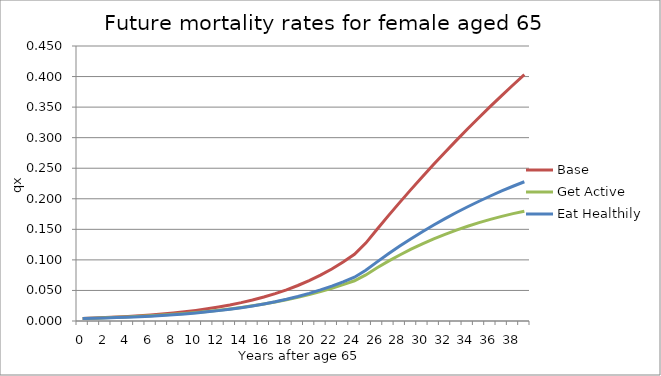
| Category | Base | Get Active | Eat Healthily |
|---|---|---|---|
| 0.0 | 0.004 | 0.004 | 0.004 |
| 1.0 | 0.005 | 0.005 | 0.004 |
| 2.0 | 0.006 | 0.005 | 0.005 |
| 3.0 | 0.006 | 0.006 | 0.006 |
| 4.0 | 0.007 | 0.007 | 0.006 |
| 5.0 | 0.009 | 0.008 | 0.007 |
| 6.0 | 0.01 | 0.009 | 0.008 |
| 7.0 | 0.011 | 0.01 | 0.009 |
| 8.0 | 0.013 | 0.011 | 0.01 |
| 9.0 | 0.015 | 0.012 | 0.012 |
| 10.0 | 0.017 | 0.014 | 0.013 |
| 11.0 | 0.02 | 0.016 | 0.015 |
| 12.0 | 0.023 | 0.018 | 0.017 |
| 13.0 | 0.026 | 0.02 | 0.019 |
| 14.0 | 0.03 | 0.022 | 0.022 |
| 15.0 | 0.034 | 0.025 | 0.025 |
| 16.0 | 0.039 | 0.028 | 0.028 |
| 17.0 | 0.045 | 0.031 | 0.032 |
| 18.0 | 0.051 | 0.035 | 0.036 |
| 19.0 | 0.058 | 0.039 | 0.04 |
| 20.0 | 0.066 | 0.043 | 0.045 |
| 21.0 | 0.075 | 0.048 | 0.051 |
| 22.0 | 0.085 | 0.054 | 0.057 |
| 23.0 | 0.096 | 0.059 | 0.064 |
| 24.0 | 0.109 | 0.066 | 0.072 |
| 25.0 | 0.128 | 0.075 | 0.083 |
| 26.0 | 0.15 | 0.087 | 0.097 |
| 27.0 | 0.172 | 0.098 | 0.11 |
| 28.0 | 0.194 | 0.108 | 0.123 |
| 29.0 | 0.215 | 0.117 | 0.135 |
| 30.0 | 0.236 | 0.126 | 0.146 |
| 31.0 | 0.256 | 0.134 | 0.157 |
| 32.0 | 0.276 | 0.142 | 0.168 |
| 33.0 | 0.296 | 0.149 | 0.177 |
| 34.0 | 0.315 | 0.155 | 0.187 |
| 35.0 | 0.333 | 0.161 | 0.196 |
| 36.0 | 0.351 | 0.166 | 0.205 |
| 37.0 | 0.369 | 0.171 | 0.213 |
| 38.0 | 0.386 | 0.176 | 0.221 |
| 39.0 | 0.403 | 0.18 | 0.228 |